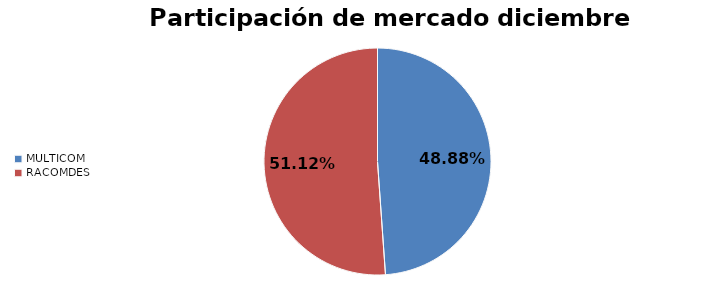
| Category | Series 0 |
|---|---|
| MULTICOM | 0.489 |
| RACOMDES | 0.511 |